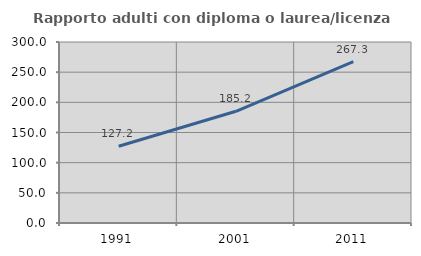
| Category | Rapporto adulti con diploma o laurea/licenza media  |
|---|---|
| 1991.0 | 127.24 |
| 2001.0 | 185.162 |
| 2011.0 | 267.304 |